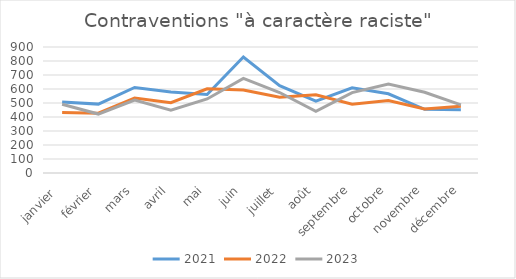
| Category | 2021 | 2022 | 2023 |
|---|---|---|---|
| janvier  | 508 | 432 | 491 |
| février | 492 | 427 | 421 |
| mars | 611 | 535 | 521 |
| avril | 579 | 502 | 449 |
| mai | 561 | 601 | 529 |
| juin | 828 | 593 | 676 |
| juillet | 624 | 541 | 575 |
| août | 513 | 559 | 441 |
| septembre | 609 | 491 | 574 |
| octobre | 566 | 518 | 635 |
| novembre | 455 | 458 | 577 |
| décembre | 451 | 477 | 487 |